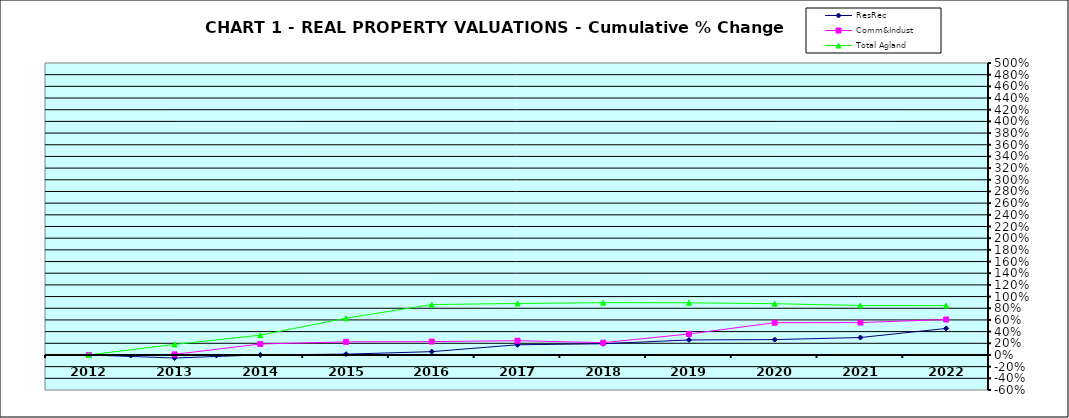
| Category | ResRec | Comm&Indust | Total Agland |
|---|---|---|---|
| 2012.0 | 0 | 0 | 0 |
| 2013.0 | -0.052 | 0.01 | 0.181 |
| 2014.0 | 0.001 | 0.188 | 0.339 |
| 2015.0 | 0.014 | 0.224 | 0.63 |
| 2016.0 | 0.057 | 0.229 | 0.863 |
| 2017.0 | 0.175 | 0.244 | 0.882 |
| 2018.0 | 0.192 | 0.21 | 0.896 |
| 2019.0 | 0.257 | 0.359 | 0.894 |
| 2020.0 | 0.263 | 0.552 | 0.878 |
| 2021.0 | 0.299 | 0.554 | 0.848 |
| 2022.0 | 0.454 | 0.607 | 0.845 |